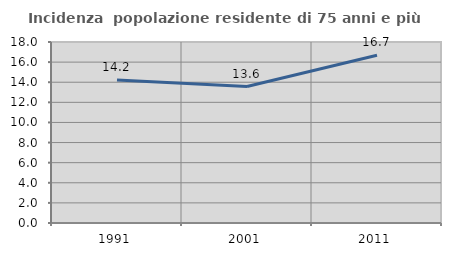
| Category | Incidenza  popolazione residente di 75 anni e più |
|---|---|
| 1991.0 | 14.212 |
| 2001.0 | 13.571 |
| 2011.0 | 16.688 |